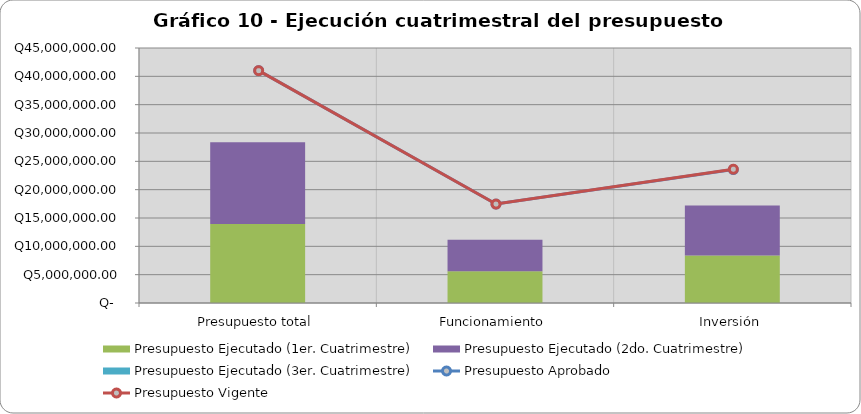
| Category | Presupuesto Ejecutado (1er. Cuatrimestre) | Presupuesto Ejecutado (2do. Cuatrimestre) | Presupuesto Ejecutado (3er. Cuatrimestre) |
|---|---|---|---|
| Presupuesto total | 13945523.28 | 14411430.39 | 0 |
| Funcionamiento | 5582906.38 | 5578157.95 | 0 |
| Inversión | 8362616.9 | 8833272.44 | 0 |